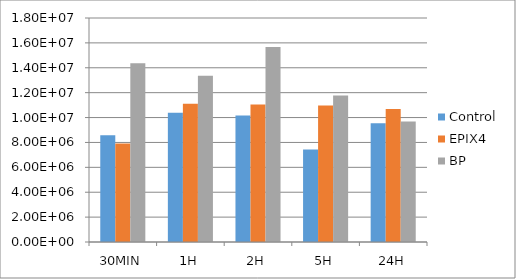
| Category | Control | EPIX4 | BP |
|---|---|---|---|
| 30MIN | 8578500 | 7923500 | 14366666.667 |
| 1H | 10396000 | 11115750 | 13360750 |
| 2H | 10173666.667 | 11045500 | 15672500 |
| 5H | 7436750 | 10976000 | 11765500 |
| 24H | 9533800 | 10693166.667 | 9691500 |